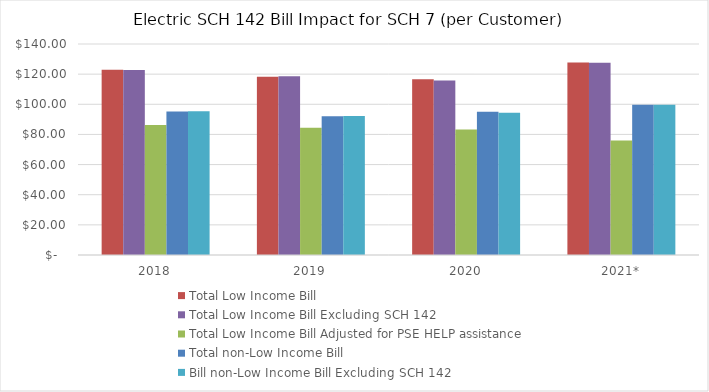
| Category | Total Low Income Bill  | Total Low Income Bill Excluding SCH 142 | Total Low Income Bill Adjusted for PSE HELP assistance  | Total non-Low Income Bill  | Bill non-Low Income Bill Excluding SCH 142 |
|---|---|---|---|---|---|
| 2018 | 122.874 | 122.785 | 86.254 | 95.234 | 95.42 |
| 2019 | 118.22 | 118.613 | 84.451 | 92.104 | 92.239 |
| 2020 | 116.639 | 115.828 | 83.234 | 95.077 | 94.4 |
| 2021* | 127.717 | 127.528 | 76.043 | 99.747 | 99.655 |